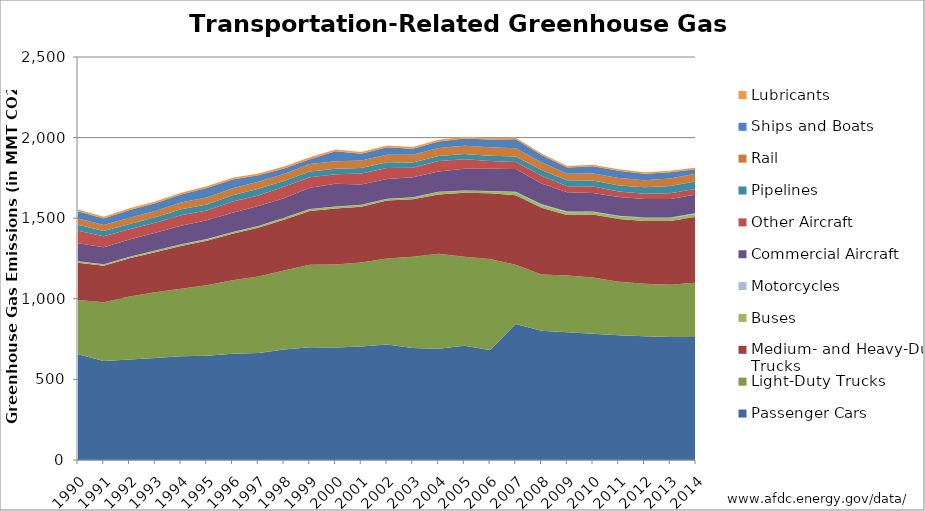
| Category | Passenger Cars | Light-Duty Trucks | Medium- and Heavy-Duty Trucks | Buses | Motorcycles | Commercial Aircraft | Other Aircraft | Pipelines | Rail | Ships and Boats | Lubricants |
|---|---|---|---|---|---|---|---|---|---|---|---|
| 1990.0 | 656.6 | 335.6 | 231.1 | 8.4 | 1.8 | 110.9 | 78.3 | 36 | 39 | 44.9 | 11.8 |
| 1991.0 | 614.7 | 364.6 | 226.3 | 7.7 | 1.7 | 104.3 | 69.1 | 32.9 | 36.8 | 40 | 10.6 |
| 1992.0 | 623.8 | 390.9 | 236.5 | 8.1 | 1.8 | 106.5 | 64.6 | 32.2 | 37.7 | 49.2 | 10.8 |
| 1993.0 | 633.3 | 406.6 | 249 | 8.8 | 1.8 | 109.8 | 62.8 | 34.1 | 38.8 | 47.8 | 11 |
| 1994.0 | 642.9 | 419.5 | 265.3 | 9.2 | 1.9 | 114.6 | 65.3 | 37.5 | 41.7 | 48.4 | 11.5 |
| 1995.0 | 646.7 | 436.8 | 275.9 | 9.2 | 1.8 | 116.3 | 60.3 | 38.2 | 43.1 | 58.5 | 11.3 |
| 1996.0 | 659.2 | 456.1 | 287.9 | 9.6 | 1.8 | 119.7 | 69.2 | 38.9 | 43.9 | 54.4 | 11 |
| 1997.0 | 663 | 475.2 | 302.1 | 9.9 | 1.8 | 124 | 65 | 41.2 | 44.1 | 39.9 | 11.6 |
| 1998.0 | 685.4 | 490 | 315.4 | 10.2 | 1.9 | 120.8 | 71.8 | 35 | 44.4 | 33.8 | 12.1 |
| 1999.0 | 698.7 | 512.2 | 333 | 11.4 | 1.9 | 131.6 | 65.5 | 35.5 | 46.1 | 29.9 | 12.2 |
| 2000.0 | 697.3 | 515 | 347.5 | 11.2 | 1.9 | 140.6 | 58.8 | 35.2 | 46.1 | 61.1 | 12.1 |
| 2001.0 | 704.1 | 520.8 | 346.1 | 10.3 | 1.7 | 125.8 | 68.2 | 34.4 | 46.5 | 42.4 | 11.1 |
| 2002.0 | 716.9 | 532.7 | 360 | 10 | 1.7 | 122.4 | 67 | 36.4 | 46.1 | 47.2 | 10.9 |
| 2003.0 | 694.2 | 567.4 | 356.6 | 10.8 | 1.7 | 124 | 59 | 32.5 | 47.8 | 37.1 | 10.1 |
| 2004.0 | 690.2 | 589 | 367.7 | 15.1 | 1.8 | 126 | 64.6 | 31.1 | 50.5 | 39.8 | 10.2 |
| 2005.0 | 708.9 | 551.5 | 398.2 | 12.1 | 1.7 | 134 | 59.7 | 32.2 | 51.1 | 44.9 | 10.2 |
| 2006.0 | 683 | 564 | 407.4 | 12.2 | 1.9 | 138.3 | 48.1 | 32.3 | 53 | 48 | 9.9 |
| 2007.0 | 843.5 | 367.2 | 432 | 17.6 | 4.3 | 141 | 42.4 | 34.2 | 52.2 | 54.7 | 10.2 |
| 2008.0 | 802.3 | 348.6 | 414.2 | 16.9 | 4.4 | 128.4 | 48.2 | 35.6 | 48.5 | 45.3 | 9.5 |
| 2009.0 | 792.8 | 351.5 | 376.3 | 16 | 4.2 | 120.6 | 36.8 | 36.7 | 41.3 | 38.6 | 8.5 |
| 2010.0 | 783.6 | 348.9 | 389.7 | 15.8 | 3.7 | 114.4 | 40.4 | 37.1 | 44.2 | 44.7 | 9.5 |
| 2011.0 | 774.3 | 332 | 388.4 | 16.8 | 3.6 | 115.7 | 34.2 | 37.8 | 45.9 | 46.4 | 9 |
| 2012.0 | 767.9 | 326 | 388.7 | 17.8 | 4.2 | 114.3 | 32.1 | 40.3 | 44.6 | 40.1 | 8.3 |
| 2013.0 | 763.2 | 323.4 | 395.7 | 18 | 4 | 115.4 | 34.7 | 45.9 | 45.5 | 39.4 | 8.8 |
| 2014.0 | 762.5 | 338.1 | 407.4 | 19.1 | 3.9 | 116.3 | 35.2 | 46.5 | 47.6 | 28.6 | 9.1 |